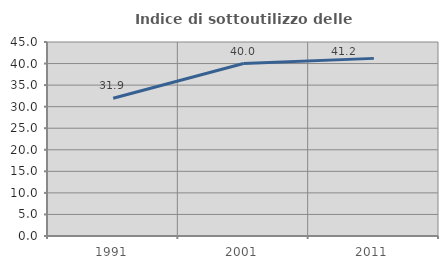
| Category | Indice di sottoutilizzo delle abitazioni  |
|---|---|
| 1991.0 | 31.937 |
| 2001.0 | 40 |
| 2011.0 | 41.202 |